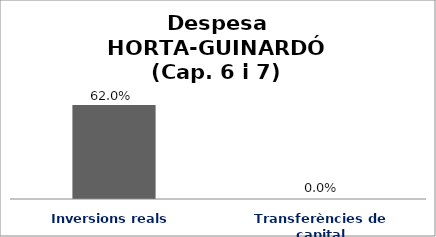
| Category | Series 0 |
|---|---|
| Inversions reals | 0.62 |
| Transferències de capital | 0 |